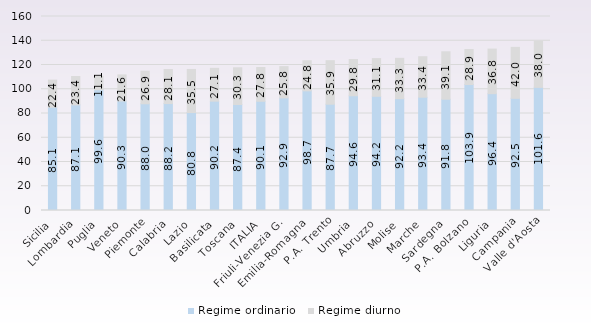
| Category | Regime ordinario | Regime diurno |
|---|---|---|
| Sicilia | 85.13 | 22.392 |
| Lombardia | 87.114 | 23.394 |
| Puglia | 99.569 | 11.077 |
| Veneto | 90.278 | 21.554 |
| Piemonte | 87.997 | 26.896 |
| Calabria | 88.192 | 28.06 |
| Lazio | 80.791 | 35.523 |
| Basilicata | 90.17 | 27.059 |
| Toscana | 87.409 | 30.282 |
| ITALIA | 90.093 | 27.821 |
| Friuli-Venezia G. | 92.863 | 25.79 |
| Emilia-Romagna | 98.687 | 24.817 |
| P.A. Trento | 87.653 | 35.908 |
| Umbria | 94.642 | 29.847 |
| Abruzzo | 94.179 | 31.09 |
| Molise | 92.226 | 33.266 |
| Marche | 93.427 | 33.391 |
| Sardegna | 91.773 | 39.109 |
| P.A. Bolzano | 103.883 | 28.9 |
| Liguria | 96.354 | 36.758 |
| Campania | 92.505 | 42.033 |
| Valle d'Aosta | 101.56 | 37.97 |